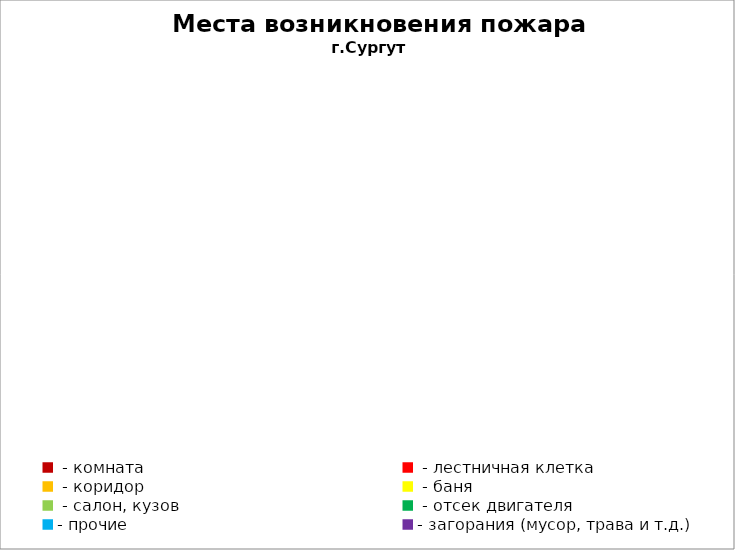
| Category | Места возникновения пожара |
|---|---|
|  - комната | 46 |
|  - лестничная клетка | 5 |
|  - коридор | 3 |
|  - баня | 22 |
|  - салон, кузов | 10 |
|  - отсек двигателя | 26 |
| - прочие | 67 |
| - загорания (мусор, трава и т.д.)  | 94 |